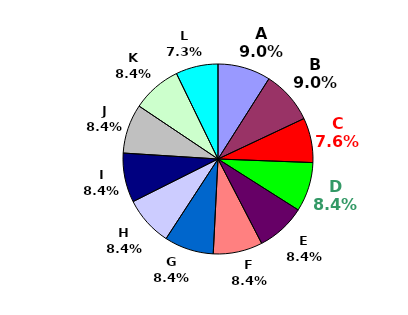
| Category | Series 0 |
|---|---|
| A | 0.09 |
| B | 0.09 |
| C | 0.076 |
| D | 0.084 |
| E | 0.084 |
| F | 0.084 |
| G | 0.084 |
| H | 0.084 |
| I | 0.084 |
| J | 0.084 |
| K | 0.084 |
| L | 0.072 |